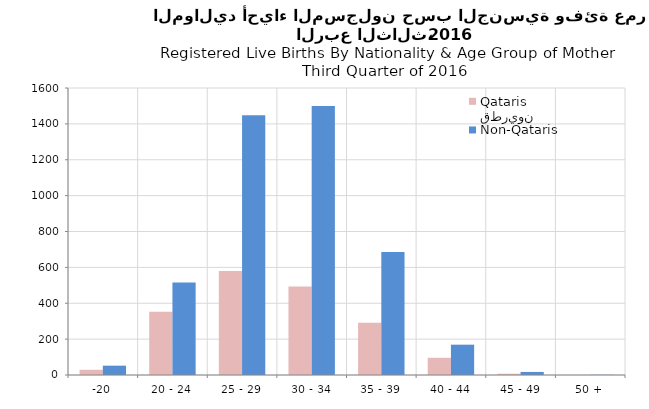
| Category | قطريون
Qataris | غير قطريين
Non-Qataris |
|---|---|---|
| -20 | 29 | 52 |
| 20 - 24 | 352 | 516 |
| 25 - 29 | 580 | 1448 |
| 30 - 34 | 494 | 1499 |
| 35 - 39 | 291 | 686 |
| 40 - 44 | 96 | 169 |
| 45 - 49 | 7 | 17 |
| 50 + | 0 | 1 |